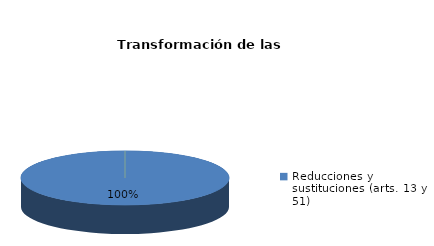
| Category | Series 0 |
|---|---|
| Reducciones y sustituciones (arts. 13 y 51) | 7 |
| Por quebrantamiento (art. 50.2) | 0 |
| Cancelaciones anticipadas | 0 |
| Traslado a Centros Penitenciarios | 0 |
| Conversión internamientos en cerrados (art. 51.2) | 0 |